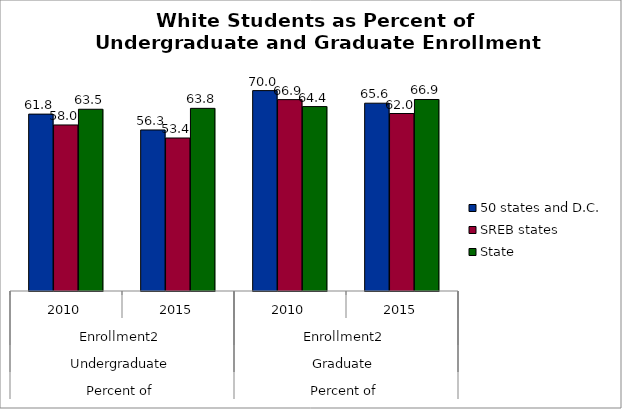
| Category | 50 states and D.C. | SREB states | State |
|---|---|---|---|
| 0 | 61.793 | 58.006 | 63.488 |
| 1 | 56.26 | 53.447 | 63.809 |
| 2 | 70.002 | 66.859 | 64.428 |
| 3 | 65.607 | 62.006 | 66.902 |